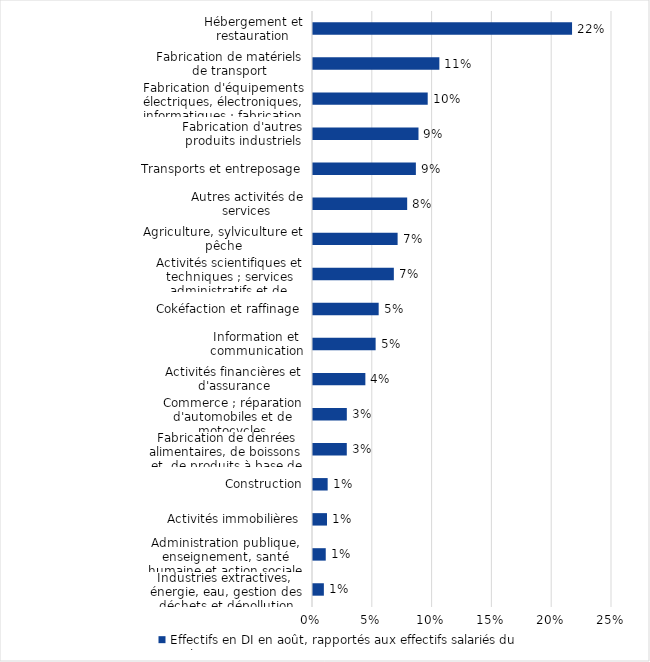
| Category | Effectifs en DI en août, rapportés aux effectifs salariés du secteur |
|---|---|
| Industries extractives,  énergie, eau, gestion des déchets et dépollution | 0.009 |
| Administration publique, enseignement, santé humaine et action sociale | 0.011 |
| Activités immobilières | 0.012 |
| Construction | 0.012 |
| Fabrication de denrées alimentaires, de boissons et  de produits à base de tabac | 0.028 |
| Commerce ; réparation d'automobiles et de motocycles | 0.028 |
| Activités financières et d'assurance | 0.044 |
| Information et communication | 0.052 |
| Cokéfaction et raffinage | 0.055 |
| Activités scientifiques et techniques ; services administratifs et de soutien | 0.068 |
| Agriculture, sylviculture et pêche | 0.071 |
| Autres activités de services | 0.079 |
| Transports et entreposage | 0.086 |
| Fabrication d'autres produits industriels | 0.088 |
| Fabrication d'équipements électriques, électroniques, informatiques ; fabrication de machines | 0.096 |
| Fabrication de matériels de transport | 0.106 |
| Hébergement et restauration | 0.217 |